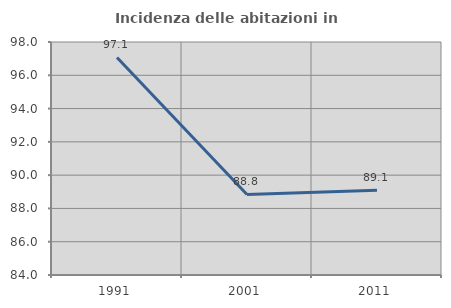
| Category | Incidenza delle abitazioni in proprietà  |
|---|---|
| 1991.0 | 97.071 |
| 2001.0 | 88.838 |
| 2011.0 | 89.091 |